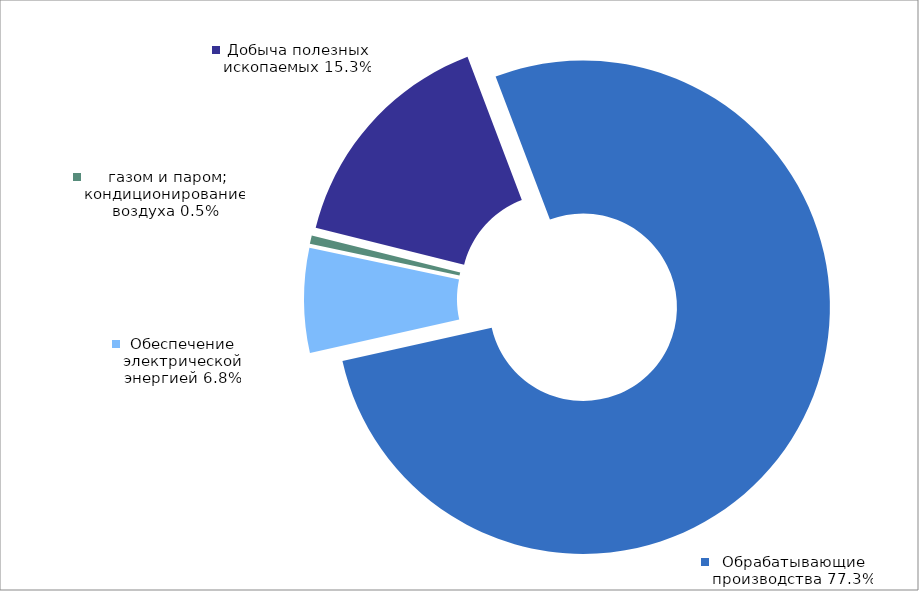
| Category | Итог |
|---|---|
| Добыча полезных ископаемых | 0.153 |
| Обрабатывающие производства | 0.773 |
| Обеспечение электрической энергией, газом и паром; кондиционирование воздуха | 0.068 |
| Водоснабжение; водоотведение, организация сбора и утилизации отходов, деятельность по ликвидации загрязнений | 0.005 |